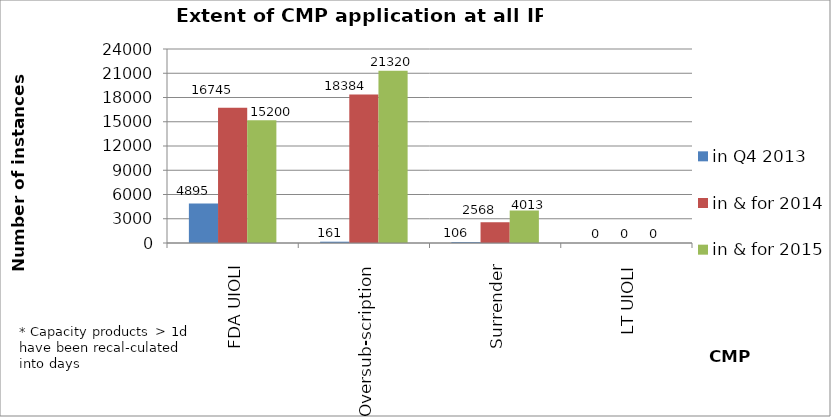
| Category | in Q4 2013 | in & for 2014 | in & for 2015 |
|---|---|---|---|
| FDA UIOLI | 4895 | 16745 | 15200 |
| Oversub-scription | 161 | 18384 | 21320 |
| Surrender | 106 | 2568 | 4013 |
| LT UIOLI | 0 | 0 | 0 |